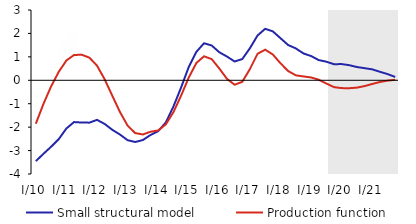
| Category | Small structural model | Production function |
|---|---|---|
| I/10 | -3.452 | -1.854 |
| II | -3.138 | -1.006 |
| III | -2.836 | -0.26 |
| IV | -2.513 | 0.362 |
| I/11 | -2.056 | 0.846 |
| II | -1.783 | 1.079 |
| III | -1.803 | 1.091 |
| IV | -1.808 | 0.967 |
| I/12 | -1.689 | 0.626 |
| II | -1.862 | 0.045 |
| III | -2.114 | -0.658 |
| IV | -2.315 | -1.35 |
| I/13 | -2.556 | -1.934 |
| II | -2.635 | -2.253 |
| III | -2.55 | -2.312 |
| IV | -2.335 | -2.195 |
| I/14 | -2.171 | -2.142 |
| II | -1.803 | -1.882 |
| III | -1.118 | -1.36 |
| IV | -0.307 | -0.656 |
| I/15 | 0.567 | 0.116 |
| II | 1.214 | 0.74 |
| III | 1.581 | 1.023 |
| IV | 1.485 | 0.904 |
| I/16 | 1.196 | 0.502 |
| II | 1.013 | 0.061 |
| III | 0.803 | -0.19 |
| IV | 0.905 | -0.067 |
| I/17 | 1.367 | 0.478 |
| II | 1.913 | 1.132 |
| III | 2.198 | 1.306 |
| IV | 2.087 | 1.1 |
| I/18 | 1.796 | 0.725 |
| II | 1.506 | 0.396 |
| III | 1.361 | 0.212 |
| IV | 1.146 | 0.164 |
| I/19 | 1.036 | 0.121 |
| II | 0.862 | 0.025 |
| III | 0.794 | -0.138 |
| IV | 0.687 | -0.293 |
| I/20 | 0.692 | -0.334 |
| II | 0.645 | -0.338 |
| III | 0.566 | -0.313 |
| IV | 0.517 | -0.248 |
| I/21 | 0.466 | -0.157 |
| II | 0.363 | -0.073 |
| III | 0.265 | -0.016 |
| IV | 0.142 | 0.021 |